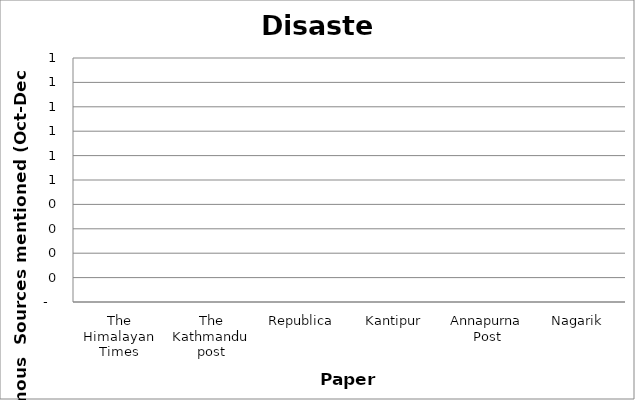
| Category | Disaster |
|---|---|
| The Himalayan Times | 0 |
| The Kathmandu post | 0 |
| Republica | 0 |
| Kantipur | 0 |
| Annapurna Post | 0 |
| Nagarik | 0 |